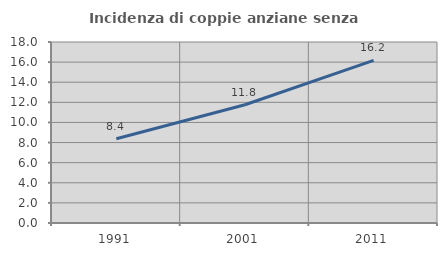
| Category | Incidenza di coppie anziane senza figli  |
|---|---|
| 1991.0 | 8.384 |
| 2001.0 | 11.762 |
| 2011.0 | 16.179 |